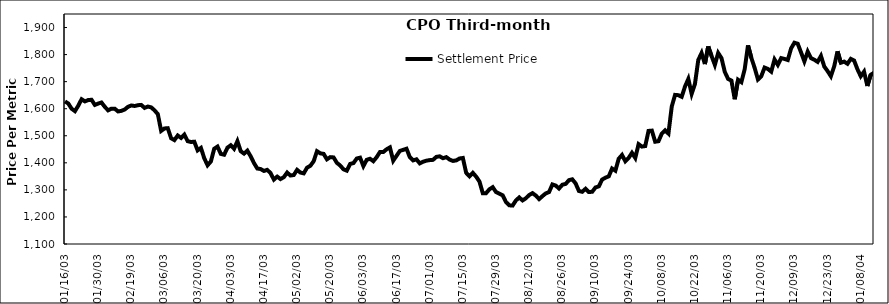
| Category | Settlement Price |
|---|---|
| 2003-01-16 | 1627 |
| 2003-01-17 | 1619 |
| 2003-01-20 | 1600 |
| 2003-01-21 | 1591 |
| 2003-01-22 | 1611 |
| 2003-01-23 | 1635 |
| 2003-01-24 | 1627 |
| 2003-01-27 | 1632 |
| 2003-01-28 | 1633 |
| 2003-01-29 | 1614 |
| 2003-01-30 | 1619 |
| 2003-02-05 | 1623 |
| 2003-02-06 | 1607 |
| 2003-02-07 | 1594 |
| 2003-02-10 | 1600 |
| 2003-02-11 | 1600 |
| 2003-02-13 | 1590 |
| 2003-02-14 | 1592 |
| 2003-02-17 | 1597 |
| 2003-02-18 | 1607 |
| 2003-02-19 | 1612 |
| 2003-02-20 | 1610 |
| 2003-02-21 | 1613 |
| 2003-02-24 | 1614 |
| 2003-02-25 | 1603 |
| 2003-02-26 | 1608 |
| 2003-02-27 | 1605 |
| 2003-02-28 | 1594 |
| 2003-03-03 | 1580 |
| 2003-03-05 | 1518 |
| 2003-03-06 | 1527 |
| 2003-03-07 | 1528 |
| 2003-03-10 | 1491 |
| 2003-03-11 | 1484 |
| 2003-03-12 | 1501 |
| 2003-03-13 | 1492 |
| 2003-03-14 | 1504 |
| 2003-03-17 | 1480 |
| 2003-03-18 | 1477 |
| 2003-03-19 | 1478 |
| 2003-03-20 | 1446 |
| 2003-03-21 | 1455 |
| 2003-03-24 | 1417 |
| 2003-03-25 | 1391 |
| 2003-03-26 | 1405 |
| 2003-03-27 | 1452 |
| 2003-03-28 | 1460 |
| 2003-03-31 | 1433 |
| 2003-04-01 | 1430 |
| 2003-04-02 | 1456 |
| 2003-04-03 | 1465 |
| 2003-04-04 | 1452 |
| 2003-04-07 | 1480 |
| 2003-04-08 | 1443 |
| 2003-04-09 | 1434 |
| 2003-04-10 | 1445 |
| 2003-04-11 | 1424 |
| 2003-04-14 | 1399 |
| 2003-04-15 | 1379 |
| 2003-04-16 | 1377 |
| 2003-04-17 | 1370 |
| 2003-04-18 | 1374 |
| 2003-04-21 | 1362 |
| 2003-04-22 | 1338 |
| 2003-04-23 | 1349 |
| 2003-04-24 | 1340 |
| 2003-04-25 | 1347 |
| 2003-04-28 | 1364 |
| 2003-04-29 | 1353 |
| 2003-04-30 | 1355 |
| 2003-05-02 | 1374 |
| 2003-05-05 | 1364 |
| 2003-05-06 | 1361 |
| 2003-05-07 | 1382 |
| 2003-05-08 | 1389 |
| 2003-05-09 | 1406 |
| 2003-05-12 | 1443 |
| 2003-05-13 | 1435 |
| 2003-05-16 | 1433 |
| 2003-05-19 | 1413 |
| 2003-05-20 | 1421 |
| 2003-05-21 | 1420 |
| 2003-05-22 | 1400 |
| 2003-05-23 | 1390 |
| 2003-05-26 | 1376 |
| 2003-05-27 | 1371 |
| 2003-05-28 | 1396 |
| 2003-05-29 | 1399 |
| 2003-05-30 | 1416 |
| 2003-06-02 | 1419 |
| 2003-06-03 | 1388 |
| 2003-06-04 | 1411 |
| 2003-06-05 | 1415 |
| 2003-06-06 | 1406 |
| 2003-06-09 | 1421 |
| 2003-06-10 | 1440 |
| 2003-06-11 | 1440 |
| 2003-06-12 | 1450 |
| 2003-06-13 | 1457 |
| 2003-06-16 | 1408 |
| 2003-06-17 | 1426 |
| 2003-06-18 | 1444 |
| 2003-06-19 | 1448 |
| 2003-06-20 | 1452 |
| 2003-06-23 | 1421 |
| 2003-06-24 | 1409 |
| 2003-06-25 | 1413 |
| 2003-06-26 | 1398 |
| 2003-06-27 | 1404 |
| 2003-06-30 | 1408 |
| 2003-07-01 | 1410 |
| 2003-07-02 | 1411 |
| 2003-07-03 | 1422 |
| 2003-07-04 | 1424 |
| 2003-07-07 | 1417 |
| 2003-07-08 | 1421 |
| 2003-07-09 | 1412 |
| 2003-07-10 | 1407 |
| 2003-07-11 | 1409 |
| 2003-07-14 | 1416 |
| 2003-07-15 | 1418 |
| 2003-07-16 | 1363 |
| 2003-07-17 | 1350 |
| 2003-07-18 | 1363 |
| 2003-07-21 | 1349 |
| 2003-07-22 | 1331 |
| 2003-07-23 | 1288 |
| 2003-07-24 | 1288 |
| 2003-07-25 | 1302 |
| 2003-07-28 | 1310 |
| 2003-07-29 | 1292 |
| 2003-07-30 | 1286 |
| 2003-07-31 | 1280 |
| 2003-08-01 | 1255 |
| 2003-08-04 | 1243 |
| 2003-08-05 | 1242 |
| 2003-08-06 | 1261 |
| 2003-08-07 | 1272 |
| 2003-08-08 | 1261 |
| 2003-08-11 | 1269 |
| 2003-08-12 | 1281 |
| 2003-08-13 | 1288 |
| 2003-08-14 | 1279 |
| 2003-08-15 | 1266 |
| 2003-08-18 | 1277 |
| 2003-08-19 | 1287 |
| 2003-08-20 | 1292 |
| 2003-08-21 | 1320 |
| 2003-08-22 | 1316 |
| 2003-08-25 | 1305 |
| 2003-08-26 | 1319 |
| 2003-08-27 | 1322 |
| 2003-08-28 | 1336 |
| 2003-08-29 | 1339 |
| 2003-09-02 | 1324 |
| 2003-09-03 | 1296 |
| 2003-09-04 | 1293 |
| 2003-09-05 | 1304 |
| 2003-09-08 | 1292 |
| 2003-09-09 | 1293 |
| 2003-09-10 | 1309 |
| 2003-09-11 | 1313 |
| 2003-09-12 | 1338 |
| 2003-09-15 | 1345 |
| 2003-09-16 | 1350 |
| 2003-09-17 | 1379 |
| 2003-09-18 | 1371 |
| 2003-09-19 | 1415 |
| 2003-09-22 | 1429 |
| 2003-09-23 | 1406 |
| 2003-09-24 | 1418 |
| 2003-09-25 | 1437 |
| 2003-09-26 | 1418 |
| 2003-09-29 | 1469 |
| 2003-09-30 | 1460 |
| 2003-10-01 | 1462 |
| 2003-10-02 | 1518 |
| 2003-10-03 | 1519 |
| 2003-10-06 | 1478 |
| 2003-10-07 | 1480 |
| 2003-10-08 | 1508 |
| 2003-10-09 | 1520 |
| 2003-10-10 | 1508 |
| 2003-10-13 | 1608 |
| 2003-10-14 | 1651 |
| 2003-10-15 | 1650 |
| 2003-10-16 | 1644 |
| 2003-10-17 | 1682 |
| 2003-10-20 | 1710 |
| 2003-10-21 | 1655 |
| 2003-10-22 | 1692 |
| 2003-10-23 | 1780 |
| 2003-10-27 | 1806 |
| 2003-10-28 | 1765 |
| 2003-10-29 | 1830 |
| 2003-10-30 | 1795 |
| 2003-10-31 | 1762 |
| 2003-11-03 | 1806 |
| 2003-11-04 | 1787 |
| 2003-11-05 | 1736 |
| 2003-11-06 | 1710 |
| 2003-11-07 | 1704 |
| 2003-11-10 | 1635 |
| 2003-11-11 | 1707 |
| 2003-11-12 | 1698 |
| 2003-11-13 | 1746 |
| 2003-11-14 | 1834 |
| 2003-11-17 | 1788 |
| 2003-11-18 | 1751 |
| 2003-11-19 | 1708 |
| 2003-11-20 | 1720 |
| 2003-11-21 | 1752 |
| 2003-11-27 | 1747 |
| 2003-11-28 | 1737 |
| 2003-12-01 | 1782 |
| 2003-12-02 | 1762 |
| 2003-12-03 | 1787 |
| 2003-12-04 | 1784 |
| 2003-12-05 | 1780 |
| 2003-12-08 | 1823 |
| 2003-12-09 | 1844 |
| 2003-12-10 | 1840 |
| 2003-12-11 | 1808 |
| 2003-12-12 | 1775 |
| 2003-12-15 | 1811 |
| 2003-12-16 | 1787 |
| 2003-12-17 | 1781 |
| 2003-12-18 | 1773 |
| 2003-12-19 | 1795 |
| 2003-12-22 | 1756 |
| 2003-12-23 | 1739 |
| 2003-12-24 | 1720 |
| 2003-12-26 | 1757 |
| 2003-12-29 | 1812 |
| 2003-12-30 | 1770 |
| 2003-12-31 | 1774 |
| 2004-01-02 | 1766 |
| 2004-01-05 | 1784 |
| 2004-01-06 | 1778 |
| 2004-01-07 | 1746 |
| 2004-01-08 | 1720 |
| 2004-01-09 | 1737 |
| 2004-01-12 | 1684 |
| 2004-01-13 | 1725 |
| 2004-01-14 | 1733 |